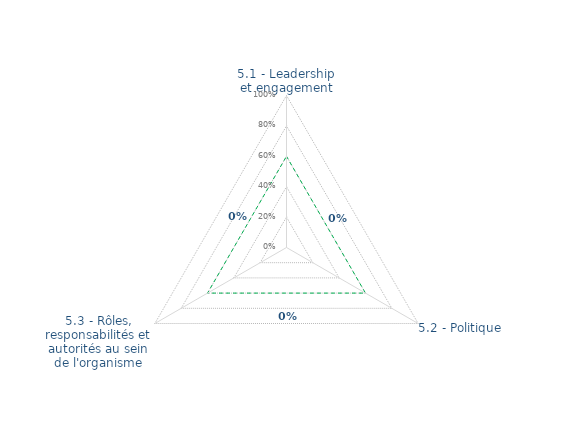
| Category | Art. 5 | limite de CONFORMITÉ |
|---|---|---|
| 5.1 - Leadership et engagement | 0 | 0.6 |
| 5.2 - Politique | 0 | 0.6 |
| 5.3 - Rôles, responsabilités et autorités au sein de l'organisme | 0 | 0.6 |